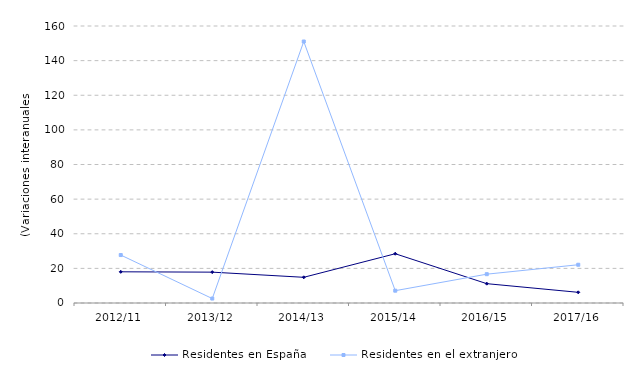
| Category | Residentes en España | Residentes en el extranjero |
|---|---|---|
| 2012/11 | 18.02 | 27.7 |
| 2013/12 | 17.82 | 2.57 |
| 2014/13 | 14.84 | 151.04 |
| 2015/14 | 28.45 | 7.12 |
| 2016/15 | 11.17 | 16.65 |
| 2017/16 | 6.165 | 22.1 |